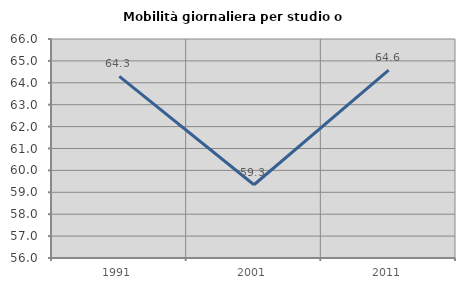
| Category | Mobilità giornaliera per studio o lavoro |
|---|---|
| 1991.0 | 64.297 |
| 2001.0 | 59.345 |
| 2011.0 | 64.582 |